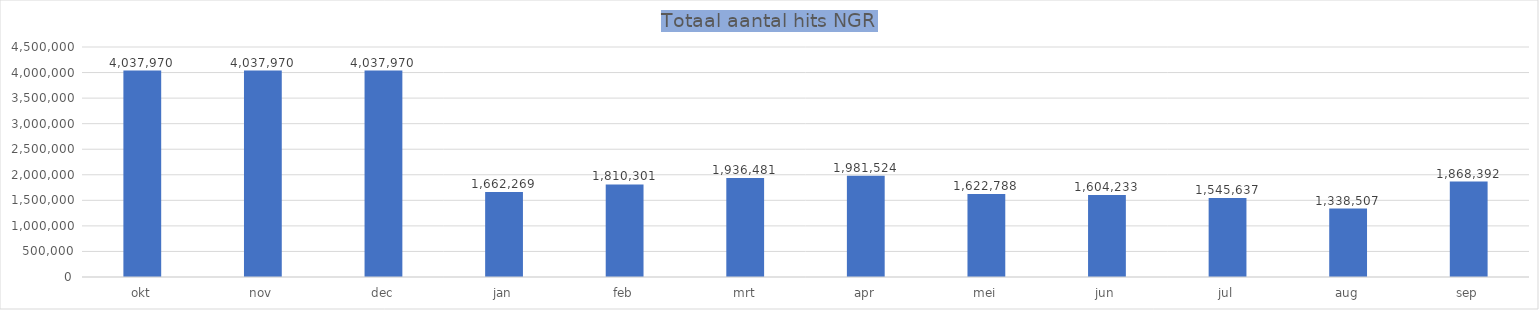
| Category | Series 0 |
|---|---|
| okt | 4037970 |
| nov | 4037970 |
| dec | 4037970 |
| jan | 1662269 |
| feb | 1810301 |
| mrt | 1936481 |
| apr | 1981524 |
| mei | 1622788 |
| jun | 1604233 |
| jul | 1545637 |
| aug | 1338507 |
| sep | 1868392 |